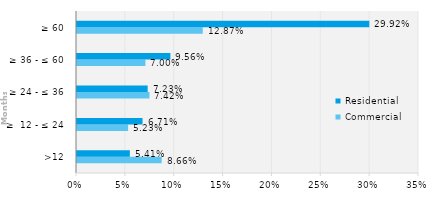
| Category | Commercial | Residential |
|---|---|---|
| >12 | 0.087 | 0.054 |
| ≥  12 - ≤ 24 | 0.052 | 0.067 |
| ≥ 24 - ≤ 36 | 0.074 | 0.072 |
| ≥ 36 - ≤ 60 | 0.07 | 0.096 |
| ≥ 60 | 0.129 | 0.299 |